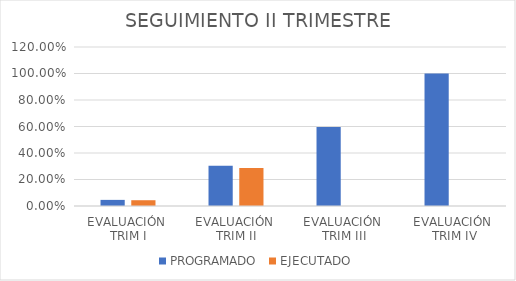
| Category | PROGRAMADO | EJECUTADO |
|---|---|---|
| EVALUACIÓN 
TRIM I | 0.046 | 0.044 |
| EVALUACIÓN 
TRIM II | 0.304 | 0.286 |
| EVALUACIÓN 
TRIM III | 0.596 | 0 |
| EVALUACIÓN
 TRIM IV | 1 | 0 |